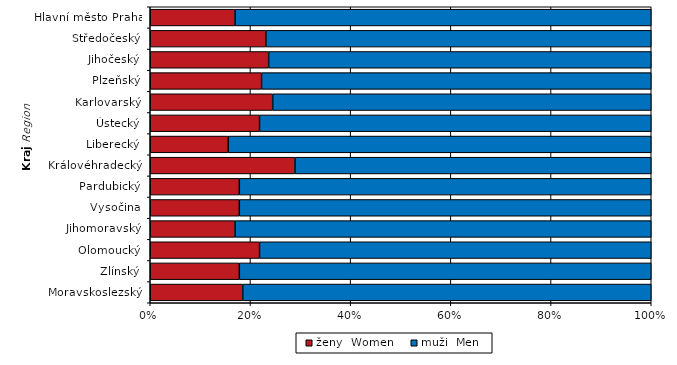
| Category | ženy | muži |
|---|---|---|
| Hlavní město Praha | 11 | 54 |
| Středočeský | 15 | 50 |
| Jihočeský | 13 | 42 |
| Plzeňský | 10 | 35 |
| Karlovarský | 11 | 34 |
| Ústecký | 12 | 43 |
| Liberecký | 7 | 38 |
| Královéhradecký | 13 | 32 |
| Pardubický | 8 | 37 |
| Vysočina | 8 | 37 |
| Jihomoravský | 11 | 54 |
| Olomoucký | 12 | 43 |
| Zlínský | 8 | 37 |
| Moravskoslezský | 12 | 53 |